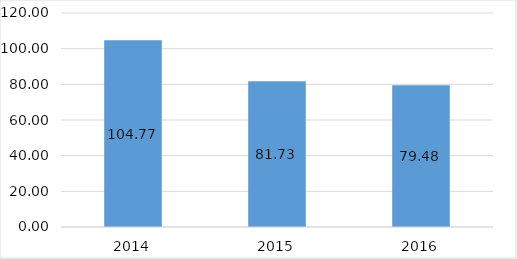
| Category | Коэффициент оборачиваемости КЗ |
|---|---|
| 2014.0 | 104.766 |
| 2015.0 | 81.726 |
| 2016.0 | 79.481 |